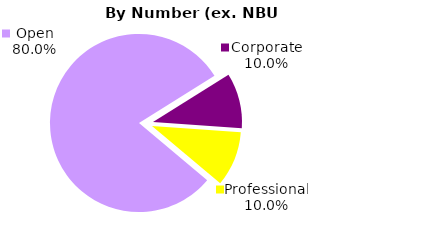
| Category | Series 0 |
|---|---|
| Open | 48 |
| Corporate | 6 |
| Professional | 6 |